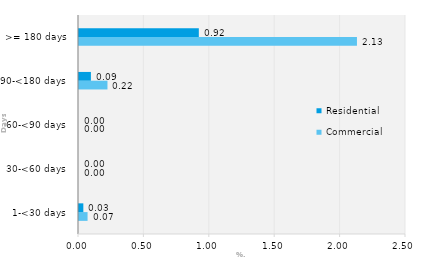
| Category | Commercial | Residential |
|---|---|---|
| 1-<30 days | 0.065 | 0.033 |
| 30-<60 days | 0 | 0 |
| 60-<90 days | 0 | 0 |
| 90-<180 days | 0.218 | 0.091 |
| >= 180 days | 2.125 | 0.916 |